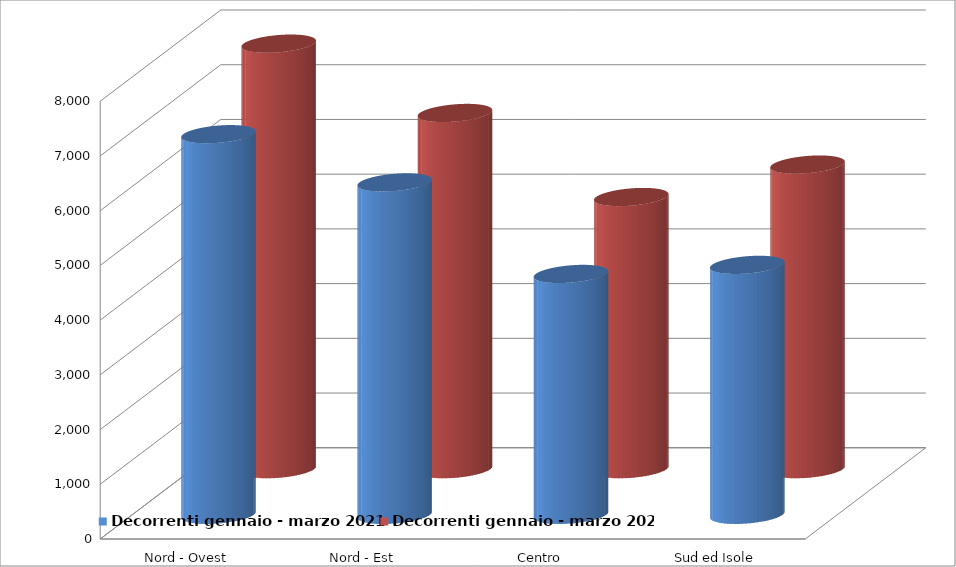
| Category | Decorrenti gennaio - marzo 2021 | Decorrenti gennaio - marzo 2020 |
|---|---|---|
| Nord - Ovest | 6956 | 7777 |
| Nord - Est | 6075 | 6510 |
| Centro | 4402 | 4974 |
| Sud ed Isole | 4568 | 5567 |